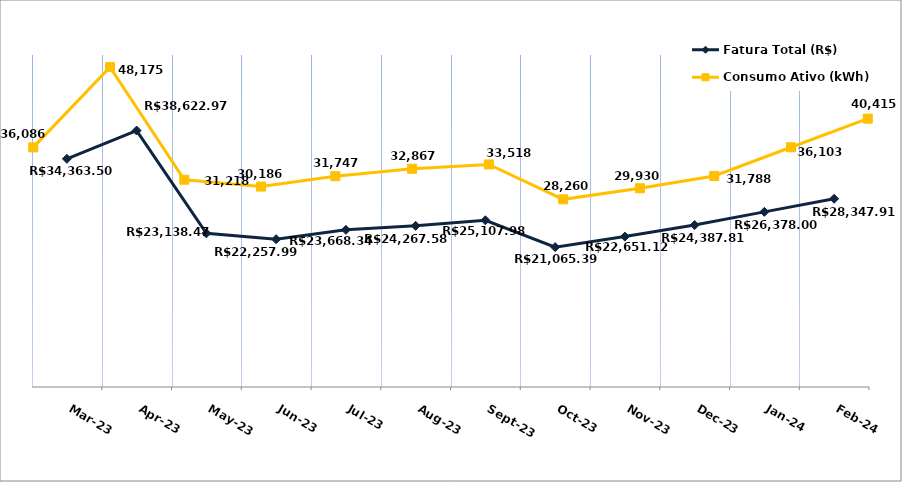
| Category | Fatura Total (R$) |
|---|---|
| 2023-03-01 | 34363.5 |
| 2023-04-01 | 38622.97 |
| 2023-05-01 | 23138.47 |
| 2023-06-01 | 22257.99 |
| 2023-07-01 | 23668.34 |
| 2023-08-01 | 24267.58 |
| 2023-09-01 | 25107.98 |
| 2023-10-01 | 21065.39 |
| 2023-11-01 | 22651.12 |
| 2023-12-01 | 24387.81 |
| 2024-01-01 | 26378 |
| 2024-02-01 | 28347.91 |